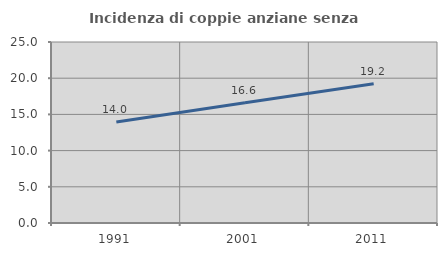
| Category | Incidenza di coppie anziane senza figli  |
|---|---|
| 1991.0 | 13.959 |
| 2001.0 | 16.623 |
| 2011.0 | 19.231 |